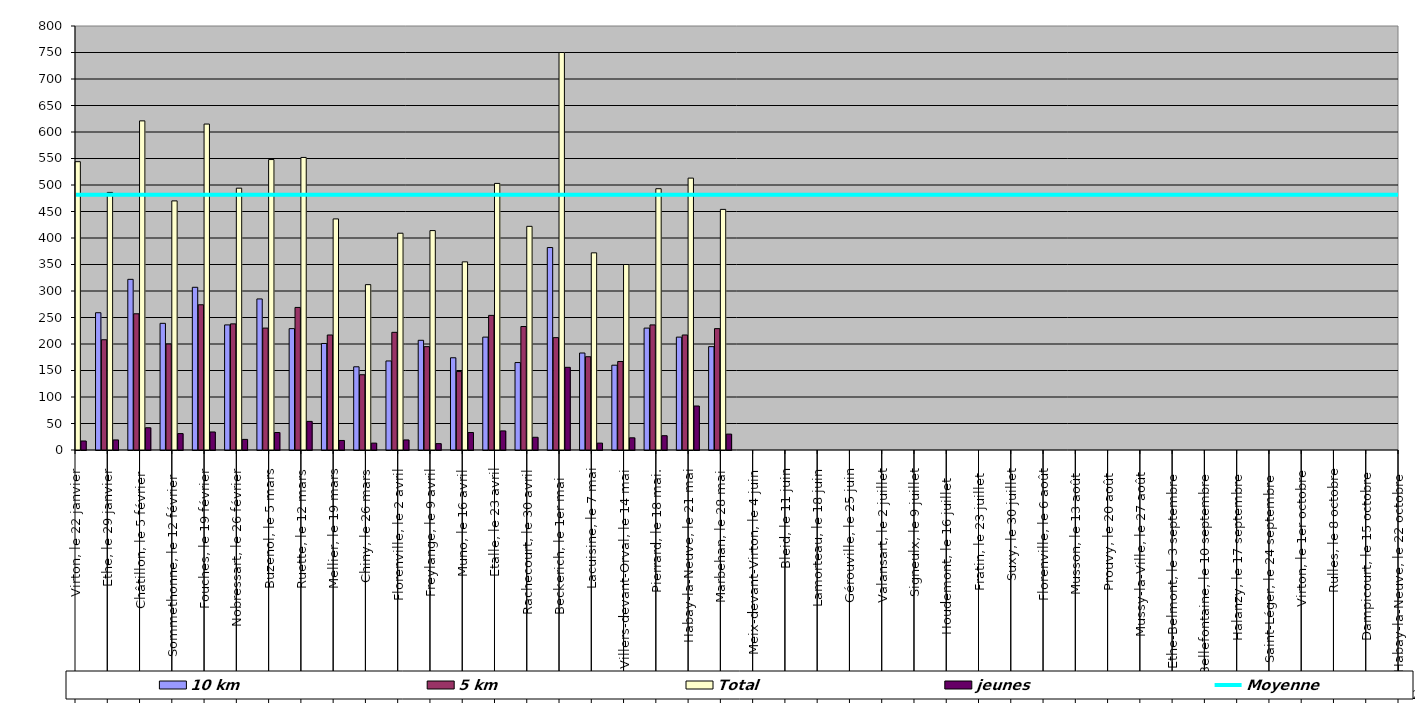
| Category | 10 km | 5 km | Total | jeunes |
|---|---|---|---|---|
| 0 | 296 | 231 | 544 | 17 |
| 1 | 259 | 208 | 486 | 19 |
| 2 | 322 | 257 | 621 | 42 |
| 3 | 239 | 200 | 470 | 31 |
| 4 | 307 | 274 | 615 | 34 |
| 5 | 236 | 238 | 494 | 20 |
| 6 | 285 | 230 | 548 | 33 |
| 7 | 229 | 269 | 552 | 54 |
| 8 | 201 | 217 | 436 | 18 |
| 9 | 157 | 142 | 312 | 13 |
| 10 | 168 | 222 | 409 | 19 |
| 11 | 207 | 195 | 414 | 12 |
| 12 | 174 | 148 | 355 | 33 |
| 13 | 213 | 254 | 503 | 36 |
| 14 | 165 | 233 | 422 | 24 |
| 15 | 382 | 212 | 750 | 156 |
| 16 | 183 | 176 | 372 | 13 |
| 17 | 160 | 167 | 350 | 23 |
| 18 | 230 | 236 | 493 | 27 |
| 19 | 213 | 217 | 513 | 83 |
| 20 | 195 | 229 | 454 | 30 |
| 21 | 0 | 0 | 0 | 0 |
| 22 | 0 | 0 | 0 | 0 |
| 23 | 0 | 0 | 0 | 0 |
| 24 | 0 | 0 | 0 | 0 |
| 25 | 0 | 0 | 0 | 0 |
| 26 | 0 | 0 | 0 | 0 |
| 27 | 0 | 0 | 0 | 0 |
| 28 | 0 | 0 | 0 | 0 |
| 29 | 0 | 0 | 0 | 0 |
| 30 | 0 | 0 | 0 | 0 |
| 31 | 0 | 0 | 0 | 0 |
| 32 | 0 | 0 | 0 | 0 |
| 33 | 0 | 0 | 0 | 0 |
| 34 | 0 | 0 | 0 | 0 |
| 35 | 0 | 0 | 0 | 0 |
| 36 | 0 | 0 | 0 | 0 |
| 37 | 0 | 0 | 0 | 0 |
| 38 | 0 | 0 | 0 | 0 |
| 39 | 0 | 0 | 0 | 0 |
| 40 | 0 | 0 | 0 | 0 |
| 41 | 0 | 0 | 0 | 0 |